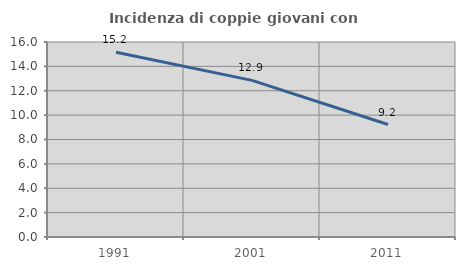
| Category | Incidenza di coppie giovani con figli |
|---|---|
| 1991.0 | 15.156 |
| 2001.0 | 12.853 |
| 2011.0 | 9.227 |